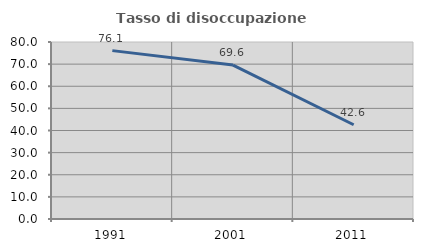
| Category | Tasso di disoccupazione giovanile  |
|---|---|
| 1991.0 | 76.098 |
| 2001.0 | 69.565 |
| 2011.0 | 42.593 |